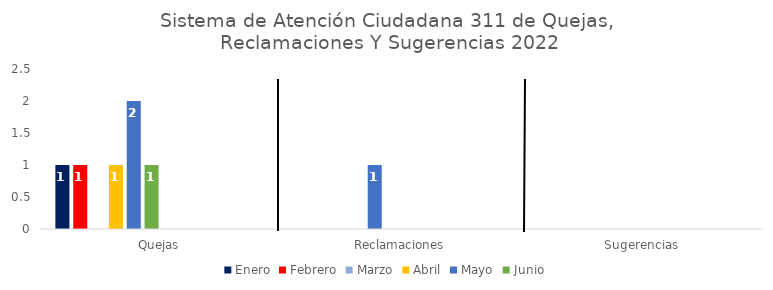
| Category | Enero | Febrero | Marzo | Abril | Mayo | Junio | Julio | Agosto | Septiembre | Octubre | Noviembre | Diciembre |
|---|---|---|---|---|---|---|---|---|---|---|---|---|
| Quejas | 1 | 1 | 0 | 1 | 2 | 1 | 0 | 0 | 0 | 0 | 0 | 0 |
| Reclamaciones | 0 | 0 | 0 | 0 | 1 | 0 | 0 | 0 | 0 | 0 | 0 | 0 |
| Sugerencias | 0 | 0 | 0 | 0 | 0 | 0 | 0 | 0 | 0 | 0 | 0 | 0 |